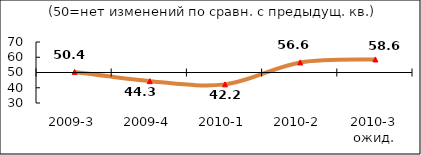
| Category | Диф.индекс ↓ |
|---|---|
| 2009-3 | 50.375 |
| 2009-4 | 44.335 |
| 2010-1 | 42.22 |
| 2010-2 | 56.61 |
| 2010-3 ожид. | 58.575 |